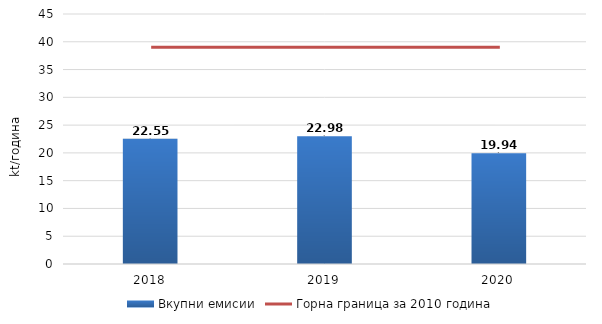
| Category | Вкупни емисии |
|---|---|
| 2018.0 | 22.548 |
| 2019.0 | 22.981 |
| 2020.0 | 19.938 |